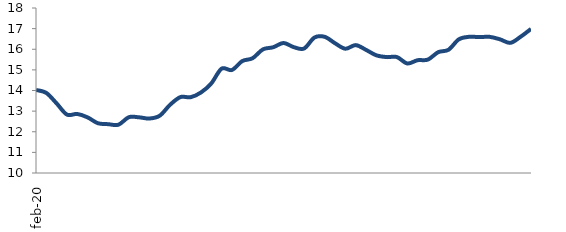
| Category | Series 0 |
|---|---|
| 2020-02-01 | 14.026 |
| 2020-03-01 | 13.882 |
| 2020-04-01 | 13.374 |
| 2020-05-01 | 12.833 |
| 2020-06-01 | 12.862 |
| 2020-07-01 | 12.698 |
| 2020-08-01 | 12.414 |
| 2020-09-01 | 12.367 |
| 2020-10-01 | 12.342 |
| 2020-11-01 | 12.705 |
| 2020-12-01 | 12.699 |
| 2021-01-01 | 12.641 |
| 2021-02-01 | 12.779 |
| 2021-03-01 | 13.308 |
| 2021-04-01 | 13.679 |
| 2021-05-01 | 13.675 |
| 2021-06-01 | 13.905 |
| 2021-07-01 | 14.345 |
| 2021-08-01 | 15.059 |
| 2021-09-01 | 14.995 |
| 2021-10-01 | 15.427 |
| 2021-11-01 | 15.564 |
| 2021-12-01 | 15.993 |
| 2022-01-01 | 16.097 |
| 2022-02-01 | 16.304 |
| 2022-03-01 | 16.101 |
| 2022-04-01 | 16.037 |
| 2022-05-01 | 16.568 |
| 2022-06-01 | 16.602 |
| 2022-07-01 | 16.29 |
| 2022-08-01 | 16.026 |
| 2022-09-01 | 16.201 |
| 2022-10-01 | 15.97 |
| 2022-11-01 | 15.706 |
| 2022-12-01 | 15.62 |
| 2023-01-01 | 15.621 |
| 2023-02-01 | 15.312 |
| 2023-03-01 | 15.467 |
| 2023-04-01 | 15.498 |
| 2023-05-01 | 15.858 |
| 2023-06-01 | 15.975 |
| 2023-07-01 | 16.48 |
| 2023-08-01 | 16.604 |
| 2023-09-01 | 16.589 |
| 2023-10-01 | 16.601 |
| 2023-11-01 | 16.48 |
| 2023-12-01 | 16.31 |
| 2024-01-01 | 16.609 |
| 2024-02-01 | 16.985 |